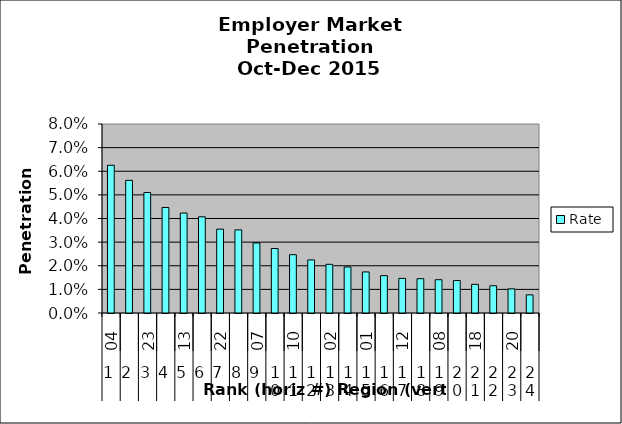
| Category | Rate |
|---|---|
| 0 | 0.063 |
| 1 | 0.056 |
| 2 | 0.051 |
| 3 | 0.045 |
| 4 | 0.042 |
| 5 | 0.041 |
| 6 | 0.036 |
| 7 | 0.035 |
| 8 | 0.03 |
| 9 | 0.027 |
| 10 | 0.025 |
| 11 | 0.022 |
| 12 | 0.021 |
| 13 | 0.019 |
| 14 | 0.017 |
| 15 | 0.016 |
| 16 | 0.015 |
| 17 | 0.015 |
| 18 | 0.014 |
| 19 | 0.014 |
| 20 | 0.012 |
| 21 | 0.012 |
| 22 | 0.01 |
| 23 | 0.008 |